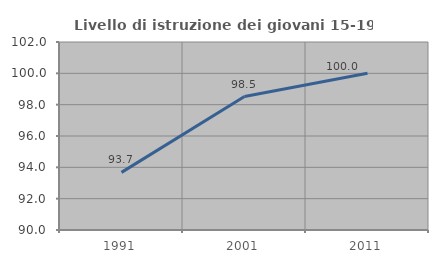
| Category | Livello di istruzione dei giovani 15-19 anni |
|---|---|
| 1991.0 | 93.678 |
| 2001.0 | 98.519 |
| 2011.0 | 100 |